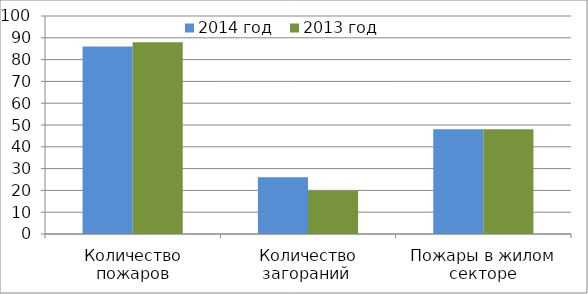
| Category | 2014 год | 2013 год |
|---|---|---|
| Количество пожаров | 86 | 88 |
| Количество загораний  | 26 | 20 |
| Пожары в жилом секторе | 48 | 48 |